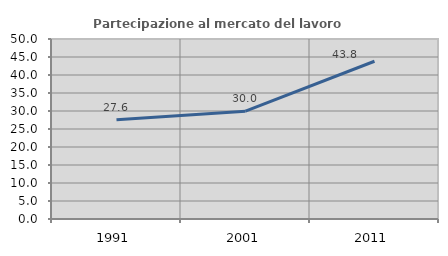
| Category | Partecipazione al mercato del lavoro  femminile |
|---|---|
| 1991.0 | 27.551 |
| 2001.0 | 29.963 |
| 2011.0 | 43.825 |